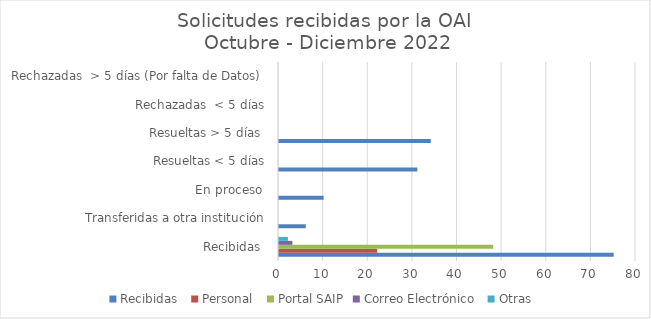
| Category | Recibidas  | Personal  | Portal SAIP | Correo Electrónico  | Otras  |
|---|---|---|---|---|---|
| Recibidas  | 75 | 22 | 48 | 3 | 2 |
|  Transferidas a otra institución | 6 | 0 | 0 | 0 | 0 |
| En proceso  | 10 | 0 | 0 | 0 | 0 |
| Resueltas < 5 días | 31 | 0 | 0 | 0 | 0 |
| Resueltas > 5 días  | 34 | 0 | 0 | 0 | 0 |
| Rechazadas  < 5 días | 0 | 0 | 0 | 0 | 0 |
| Rechazadas  > 5 días (Por falta de Datos)  | 0 | 0 | 0 | 0 | 0 |